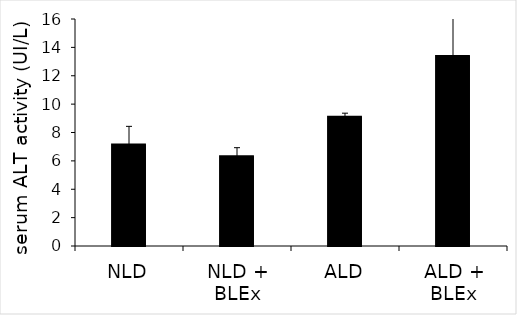
| Category | Series 0 |
|---|---|
| NLD | 7.163 |
| NLD + BLEx | 6.327 |
| ALD | 9.103 |
| ALD + BLEx | 13.393 |